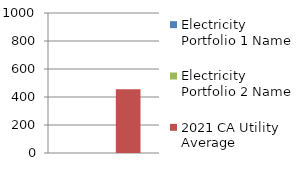
| Category | Electricity Portfolio 1 Name | Electricity Portfolio 2 Name | 2021 CA Utility Average |
|---|---|---|---|
| 0 | 0 | 0 | 456 |